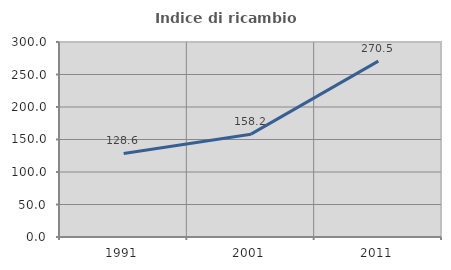
| Category | Indice di ricambio occupazionale  |
|---|---|
| 1991.0 | 128.589 |
| 2001.0 | 158.231 |
| 2011.0 | 270.526 |